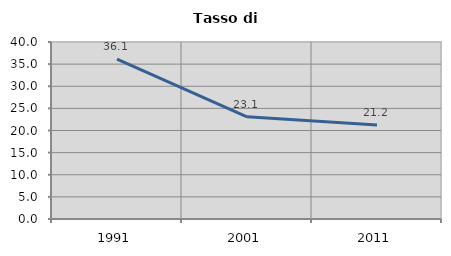
| Category | Tasso di disoccupazione   |
|---|---|
| 1991.0 | 36.122 |
| 2001.0 | 23.105 |
| 2011.0 | 21.237 |